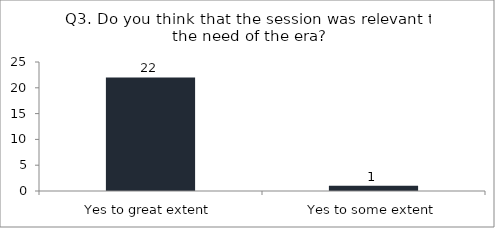
| Category | Q3. Do you think that the session was relevant to the need of the era? |
|---|---|
| Yes to great extent | 22 |
| Yes to some extent | 1 |